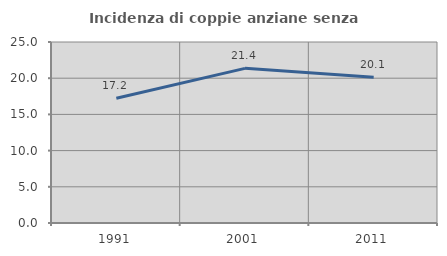
| Category | Incidenza di coppie anziane senza figli  |
|---|---|
| 1991.0 | 17.231 |
| 2001.0 | 21.359 |
| 2011.0 | 20.137 |